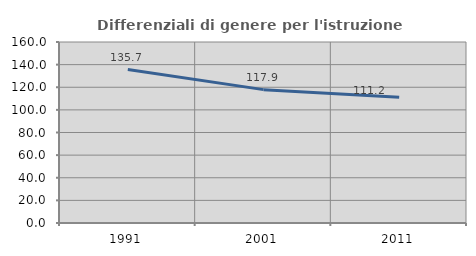
| Category | Differenziali di genere per l'istruzione superiore |
|---|---|
| 1991.0 | 135.685 |
| 2001.0 | 117.892 |
| 2011.0 | 111.184 |